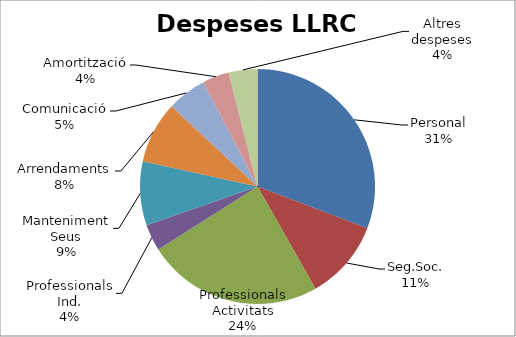
| Category | Despeses LLRC 2015 |
|---|---|
| Personal | 42000 |
| Seg.Soc. | 15000 |
| Professionals Activitats | 33000 |
| Professionals Ind. | 5000 |
| Manteniment Seus | 12000 |
| Arrendaments | 11600 |
| Comunicació | 7400 |
| Amortització | 5000 |
| Altres despeses | 5400 |